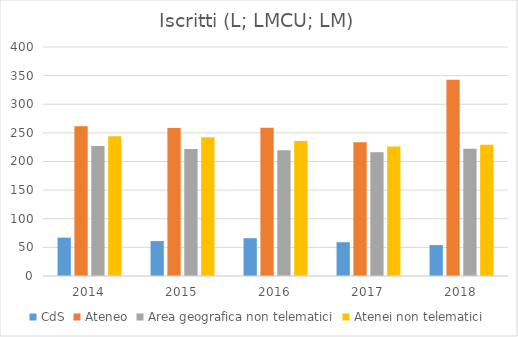
| Category | CdS | Ateneo | Area geografica non telematici | Atenei non telematici |
|---|---|---|---|---|
| 2014.0 | 67 | 261.7 | 227.1 | 243.9 |
| 2015.0 | 61 | 258.3 | 221.8 | 242.5 |
| 2016.0 | 66 | 259 | 219.7 | 235.9 |
| 2017.0 | 59 | 233.7 | 216.2 | 226.3 |
| 2018.0 | 54 | 343 | 222.2 | 229.3 |